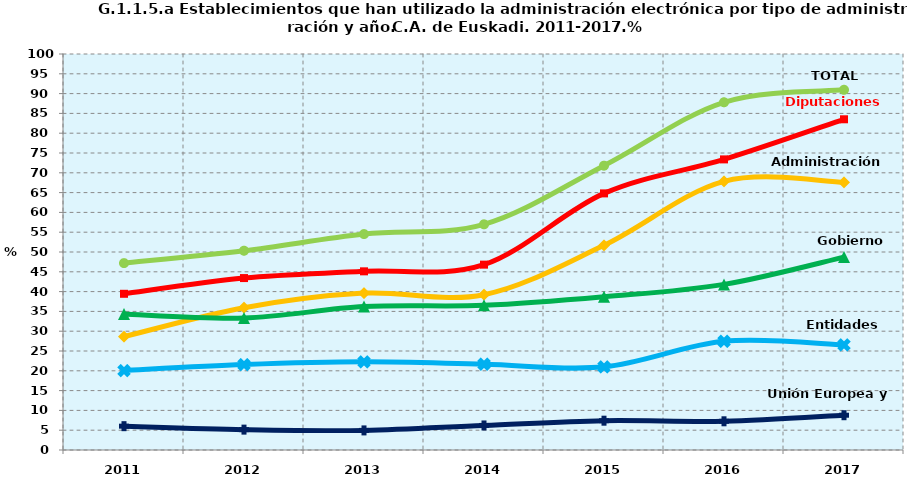
| Category | TOTAL | Diputaciones Forales | Administración Central | Gobierno Vasco | Entidades Locales | Unión Europea y Otros |
|---|---|---|---|---|---|---|
| 2011.0 | 47.195 | 39.446 | 28.619 | 34.347 | 20.063 | 6.017 |
| 2012.0 | 50.321 | 43.417 | 35.926 | 33.339 | 21.568 | 5.144 |
| 2013.0 | 54.524 | 45.118 | 39.622 | 36.207 | 22.264 | 4.948 |
| 2014.0 | 56.986 | 46.807 | 39.221 | 36.539 | 21.658 | 6.198 |
| 2015.0 | 71.8 | 64.8 | 51.7 | 38.7 | 21 | 7.4 |
| 2016.0 | 87.813 | 73.385 | 67.853 | 41.82 | 27.461 | 7.249 |
| 2017.0 | 90.959 | 83.514 | 67.612 | 48.718 | 26.543 | 8.784 |